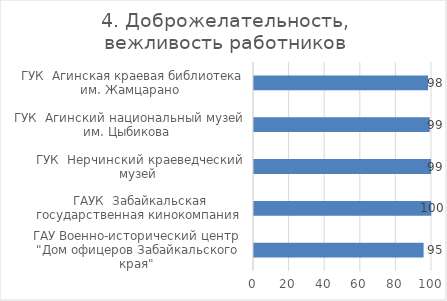
| Category | 4. Доброжелательность, вежливость работников |
|---|---|
| ГАУ Военно-исторический центр  "Дом офицеров Забайкальского края"  | 95.287 |
| ГАУК  Забайкальская государственная кинокомпания  | 99.57 |
| ГУК  Нерчинский краеведческий музей  | 99.461 |
| ГУК  Агинский национальный музей им. Цыбикова  | 98.742 |
| ГУК  Агинская краевая библиотека им. Жамцарано  | 97.81 |